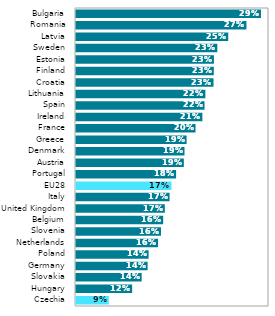
| Category | Series 0 |
|---|---|
| Czechia | 0.092 |
| Hungary | 0.123 |
| Slovakia | 0.135 |
| Germany | 0.143 |
| Poland | 0.144 |
| Netherlands | 0.156 |
| Slovenia | 0.16 |
| Belgium | 0.163 |
| United Kingdom | 0.165 |
| Italy | 0.171 |
| EU28 | 0.174 |
| Portugal | 0.18 |
| Austria | 0.19 |
| Denmark | 0.191 |
| Greece | 0.193 |
| France | 0.205 |
| Ireland | 0.214 |
| Spain | 0.217 |
| Lithuania | 0.218 |
| Croatia | 0.228 |
| Finland | 0.229 |
| Estonia | 0.229 |
| Sweden | 0.233 |
| Latvia | 0.247 |
| Romania | 0.271 |
| Bulgaria | 0.29 |